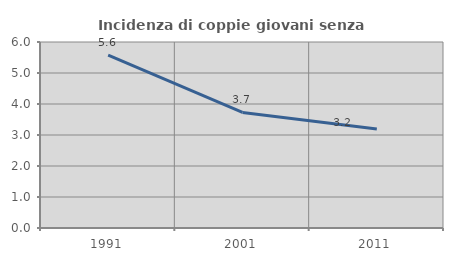
| Category | Incidenza di coppie giovani senza figli |
|---|---|
| 1991.0 | 5.574 |
| 2001.0 | 3.729 |
| 2011.0 | 3.191 |